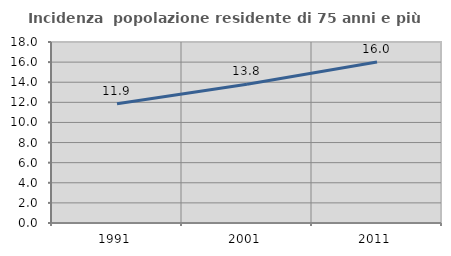
| Category | Incidenza  popolazione residente di 75 anni e più |
|---|---|
| 1991.0 | 11.859 |
| 2001.0 | 13.797 |
| 2011.0 | 16.009 |